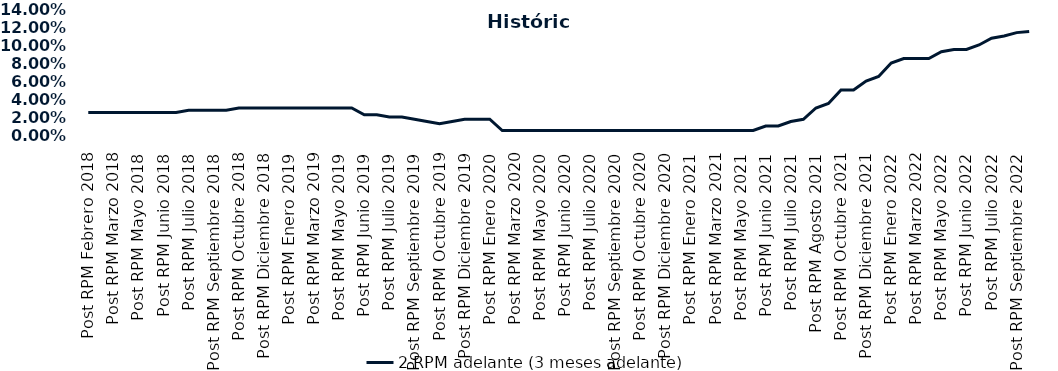
| Category | 2 RPM adelante (3 meses adelante) |
|---|---|
| Post RPM Febrero 2018 | 0.025 |
| Pre RPM Marzo 2018 | 0.025 |
| Post RPM Marzo 2018 | 0.025 |
| Pre RPM Mayo 2018 | 0.025 |
| Post RPM Mayo 2018 | 0.025 |
| Pre RPM Junio 2018 | 0.025 |
| Post RPM Junio 2018 | 0.025 |
| Pre RPM Julio 2018 | 0.025 |
| Post RPM Julio 2018 | 0.028 |
| Pre RPM Septiembre 2018 | 0.028 |
| Post RPM Septiembre 2018 | 0.028 |
| Pre RPM Octubre 2018 | 0.028 |
| Post RPM Octubre 2018 | 0.03 |
| Pre RPM Diciembre 2018 | 0.03 |
| Post RPM Diciembre 2018 | 0.03 |
| Pre RPM Enero 2019 | 0.03 |
| Post RPM Enero 2019 | 0.03 |
| Pre RPM Marzo 2019 | 0.03 |
| Post RPM Marzo 2019 | 0.03 |
| Pre RPM Mayo 2019 | 0.03 |
| Post RPM Mayo 2019 | 0.03 |
| Pre RPM Junio 2019 | 0.03 |
| Post RPM Junio 2019 | 0.022 |
| Pre RPM Julio 2019 | 0.022 |
| Post RPM Julio 2019 | 0.02 |
| Pre RPM Septiembre 2019 | 0.02 |
| Post RPM Septiembre 2019 | 0.018 |
| Pre RPM Octubre 2019 | 0.015 |
| Post RPM Octubre 2019 | 0.012 |
| Pre RPM Diciembre 2019 | 0.015 |
| Post RPM Diciembre 2019 | 0.018 |
| Pre RPM Enero 2020 | 0.018 |
| Post RPM Enero 2020 | 0.018 |
| Pre RPM Marzo 2020 | 0.005 |
| Post RPM Marzo 2020 | 0.005 |
| Pre RPM Mayo 2020 | 0.005 |
| Post RPM Mayo 2020 | 0.005 |
| Pre RPM Junio 2020 | 0.005 |
| Post RPM Junio 2020 | 0.005 |
| Pre RPM Julio 2020 | 0.005 |
| Post RPM Julio 2020 | 0.005 |
| Pre RPM Septiembre 2020 | 0.005 |
| Post RPM Septiembre 2020 | 0.005 |
| Pre RPM Octubre 2020 | 0.005 |
| Post RPM Octubre 2020 | 0.005 |
| Pre RPM Diciembre 2020 | 0.005 |
| Post RPM Diciembre 2020 | 0.005 |
| Pre RPM Enero 2021 | 0.005 |
| Post RPM Enero 2021 | 0.005 |
| Pre RPM Marzo 2021 | 0.005 |
| Post RPM Marzo 2021 | 0.005 |
| Pre RPM Mayo 2021 | 0.005 |
| Post RPM Mayo 2021 | 0.005 |
| Pre RPM Junio 2021 | 0.005 |
| Post RPM Junio 2021 | 0.01 |
| Pre RPM Julio 2021 | 0.01 |
| Post RPM Julio 2021 | 0.015 |
| Pre RPM Agosto 2021 | 0.018 |
| Post RPM Agosto 2021 | 0.03 |
| Pre RPM Octubre 2021 | 0.035 |
| Post RPM Octubre 2021 | 0.05 |
| Pre RPM Diciembre 2021 | 0.05 |
| Post RPM Diciembre 2021 | 0.06 |
| Pre RPM Enero 2022 | 0.065 |
| Post RPM Enero 2022 | 0.08 |
| Pre RPM Marzo 2022 | 0.085 |
| Post RPM Marzo 2022 | 0.085 |
| Pre RPM Mayo 2022 | 0.085 |
| Post RPM Mayo 2022 | 0.092 |
| Pre RPM Junio 2022 | 0.095 |
| Post RPM Junio 2022 | 0.095 |
| Pre RPM Julio 2022 | 0.1 |
| Post RPM Julio 2022 | 0.108 |
| Pre RPM Septiembre 2022 | 0.11 |
| Post RPM Septiembre 2022 | 0.114 |
| Pre RPM Octubre 2022 | 0.115 |